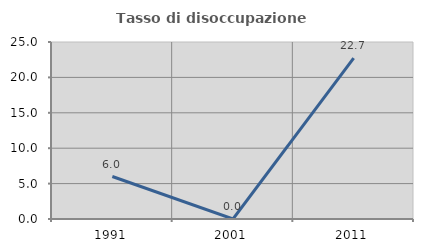
| Category | Tasso di disoccupazione giovanile  |
|---|---|
| 1991.0 | 6 |
| 2001.0 | 0 |
| 2011.0 | 22.727 |